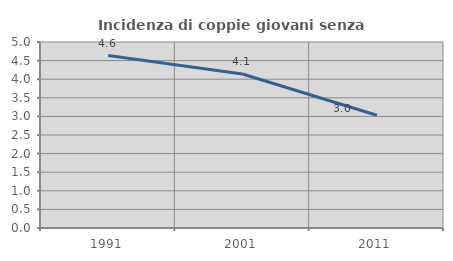
| Category | Incidenza di coppie giovani senza figli |
|---|---|
| 1991.0 | 4.635 |
| 2001.0 | 4.14 |
| 2011.0 | 3.032 |